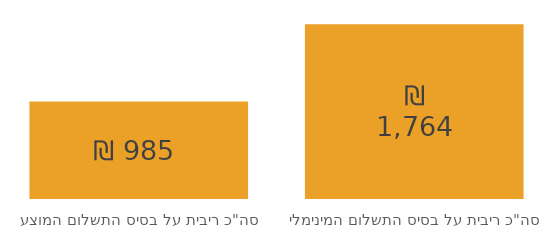
| Category | Series 0 |
|---|---|
| סה"כ ריבית על בסיס התשלום המינימלי | 1763.952 |
| סה"כ ריבית על בסיס התשלום המוצע | 984.811 |